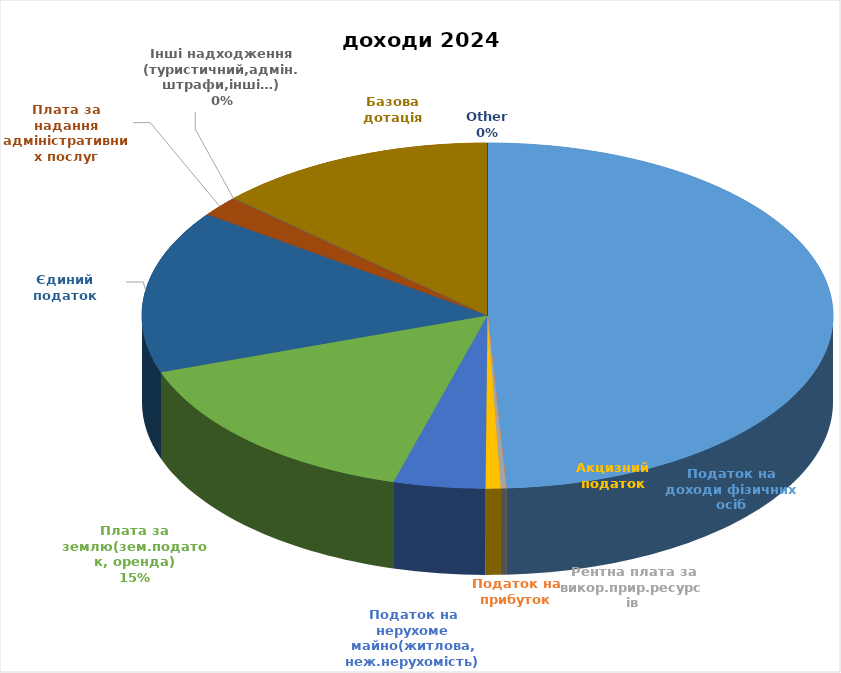
| Category | Series 0 |
|---|---|
| Податок на доходи фізичних осіб | 10215608 |
| Податок на прибуток | 1100 |
| Рентна плата за викор.прир.ресурсів | 51150 |
| Акцизний податок | 147001 |
| Податок на нерухоме майно(житлова, неж.нерухомість) | 892600 |
| Плата за землю(зем.податок, оренда) | 3179000 |
| Єдиний податок | 3176000 |
| Плата за надання адміністративних послуг | 392000 |
| Інші надходження (туристичний,адмін.штрафи,інші…) | 10115 |
| Базова дотація | 2727200 |